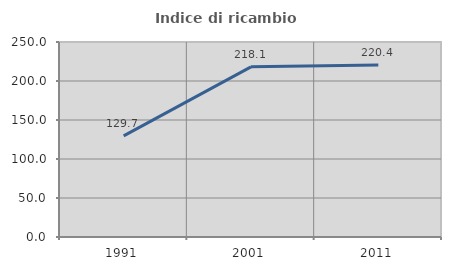
| Category | Indice di ricambio occupazionale  |
|---|---|
| 1991.0 | 129.655 |
| 2001.0 | 218.121 |
| 2011.0 | 220.359 |